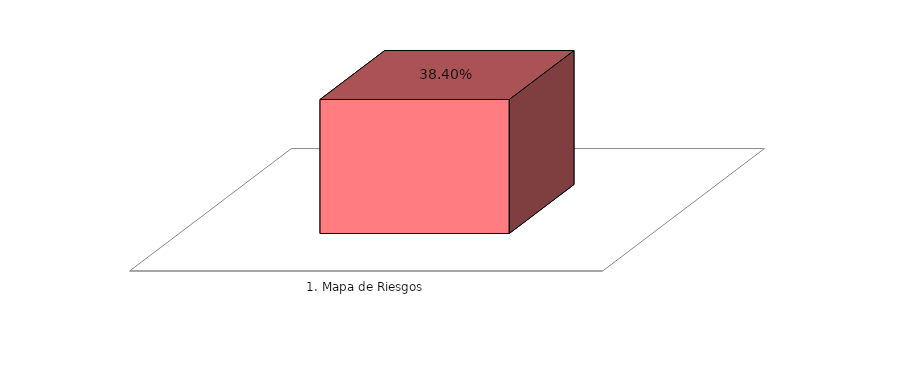
| Category | Series 0 |
|---|---|
| 1. Mapa de Riesgos | 0.384 |